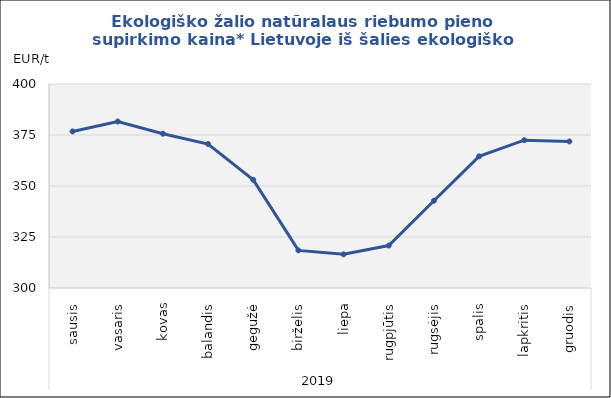
| Category | Ekologiško žalio natūralaus riebumo pieno supirkimo kaina* Lietuvoje iš šalies ekologiško pieno gamintojų |
|---|---|
| 0 | 376.75 |
| 1 | 381.61 |
| 2 | 375.62 |
| 3 | 370.57 |
| 4 | 353.02 |
| 5 | 318.43 |
| 6 | 316.5 |
| 7 | 320.81 |
| 8 | 342.76 |
| 9 | 364.55 |
| 10 | 372.45 |
| 11 | 371.84 |